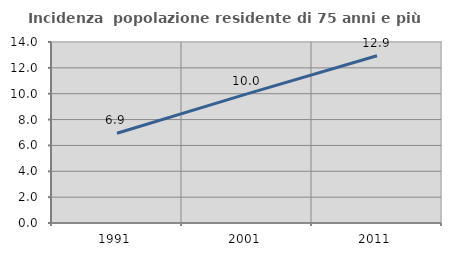
| Category | Incidenza  popolazione residente di 75 anni e più |
|---|---|
| 1991.0 | 6.938 |
| 2001.0 | 9.985 |
| 2011.0 | 12.939 |